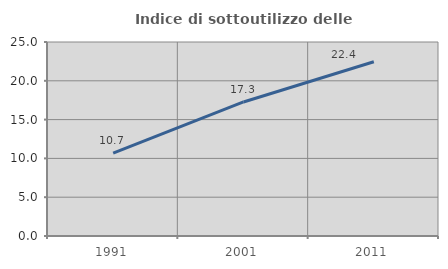
| Category | Indice di sottoutilizzo delle abitazioni  |
|---|---|
| 1991.0 | 10.687 |
| 2001.0 | 17.273 |
| 2011.0 | 22.449 |